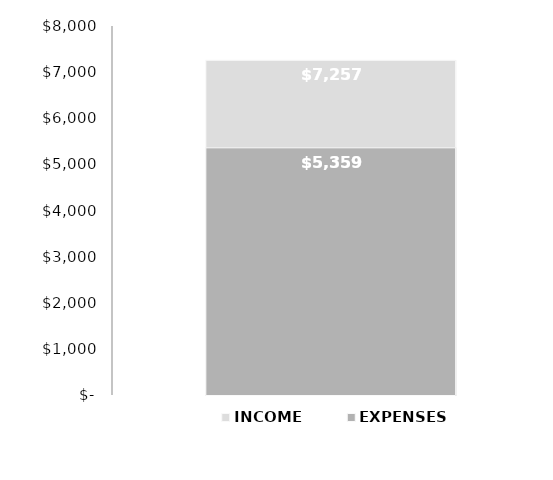
| Category | INCOME | EXPENSES |
|---|---|---|
| 0 | 7257 | 5359 |